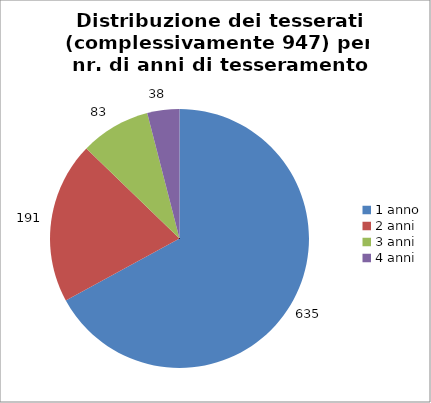
| Category | Nr. Tesserati |
|---|---|
| 1 anno | 635 |
| 2 anni | 191 |
| 3 anni | 83 |
| 4 anni | 38 |